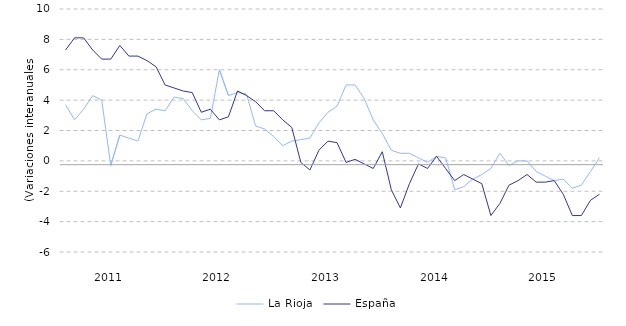
| Category | La Rioja | España |
|---|---|---|
| nan | 3.7 | 7.3 |
| nan | 2.7 | 8.1 |
| nan | 3.4 | 8.1 |
| nan | 4.3 | 7.3 |
| nan | 4 | 6.7 |
| 2011.0 | -0.3 | 6.7 |
| nan | 1.7 | 7.6 |
| nan | 1.5 | 6.9 |
| nan | 1.3 | 6.9 |
| nan | 3.1 | 6.6 |
| nan | 3.4 | 6.2 |
| nan | 3.3 | 5 |
| nan | 4.2 | 4.8 |
| nan | 4.1 | 4.6 |
| nan | 3.3 | 4.5 |
| nan | 2.7 | 3.2 |
| nan | 2.8 | 3.4 |
| 2012.0 | 6 | 2.7 |
| nan | 4.3 | 2.9 |
| nan | 4.5 | 4.6 |
| nan | 4.4 | 4.3 |
| nan | 2.3 | 3.9 |
| nan | 2.1 | 3.3 |
| nan | 1.6 | 3.3 |
| nan | 1 | 2.7 |
| nan | 1.3 | 2.2 |
| nan | 1.4 | -0.1 |
| nan | 1.5 | -0.6 |
| nan | 2.5 | 0.7 |
| 2013.0 | 3.2 | 1.3 |
| nan | 3.6 | 1.2 |
| nan | 5 | -0.1 |
| nan | 5 | 0.1 |
| nan | 4.1 | -0.2 |
| nan | 2.7 | -0.5 |
| nan | 1.8 | 0.6 |
| nan | 0.7 | -1.9 |
| nan | 0.5 | -3.1 |
| nan | 0.5 | -1.5 |
| nan | 0.2 | -0.2 |
| nan | -0.1 | -0.5 |
| 2014.0 | 0.3 | 0.3 |
| nan | 0.2 | -0.5 |
| nan | -1.9 | -1.3 |
| nan | -1.7 | -0.9 |
| nan | -1.2 | -1.2 |
| nan | -0.9 | -1.5 |
| nan | -0.5 | -3.6 |
| nan | 0.5 | -2.8 |
| nan | -0.3 | -1.6 |
| nan | 0 | -1.3 |
| nan | 0 | -0.9 |
| nan | -0.7 | -1.4 |
| 2015.0 | -1 | -1.4 |
| nan | -1.3 | -1.3 |
| nan | -1.2 | -2.2 |
| nan | -1.8 | -3.6 |
| nan | -1.6 | -3.6 |
| nan | -0.7 | -2.6 |
| nan | 0.2 | -2.2 |